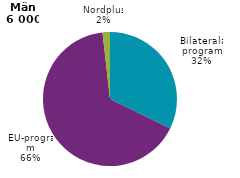
| Category | Series 0 |
|---|---|
| Utbytesprogram | 0 |
| Bilaterala program | 1937 |
| EU-program | 3962 |
| Nordplus | 107 |